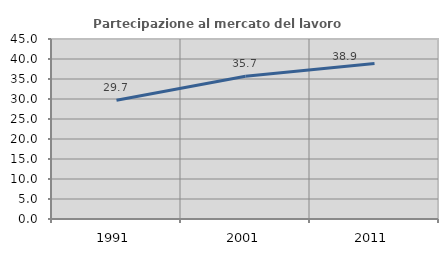
| Category | Partecipazione al mercato del lavoro  femminile |
|---|---|
| 1991.0 | 29.691 |
| 2001.0 | 35.684 |
| 2011.0 | 38.885 |